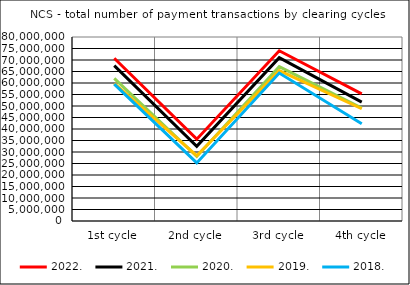
| Category | 2022. | 2021. |
|---|---|---|
| 0 | 70775189 | 67581757 |
| 1 | 35575630 | 32436650 |
| 2 | 74023758 | 71013147 |
| 3 | 55273092 | 51708137 |